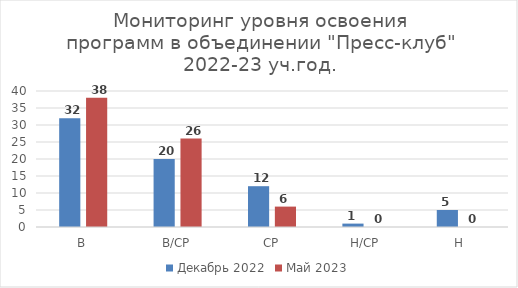
| Category | Декабрь 2022 | Май 2023 |
|---|---|---|
| В | 32 | 38 |
| В/СР | 20 | 26 |
| СР | 12 | 6 |
| Н/СР | 1 | 0 |
| Н | 5 | 0 |